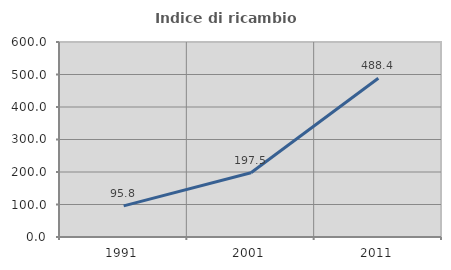
| Category | Indice di ricambio occupazionale  |
|---|---|
| 1991.0 | 95.764 |
| 2001.0 | 197.489 |
| 2011.0 | 488.417 |